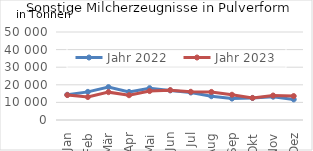
| Category | Jahr 2022 | Jahr 2023 |
|---|---|---|
| Jan | 14340.749 | 14177.849 |
| Feb | 15987.535 | 13053.356 |
| Mär | 18692.616 | 15827.491 |
| Apr | 15957.632 | 14071.666 |
| Mai | 18091.914 | 16434.889 |
| Jun | 16825.55 | 16966.541 |
| Jul | 15603.202 | 16031.973 |
| Aug | 13508.81 | 15952.001 |
| Sep | 12173.54 | 14350.387 |
| Okt | 12520.206 | 12543.861 |
| Nov | 13228.63 | 13912.325 |
| Dez | 11697.177 | 13610.7 |